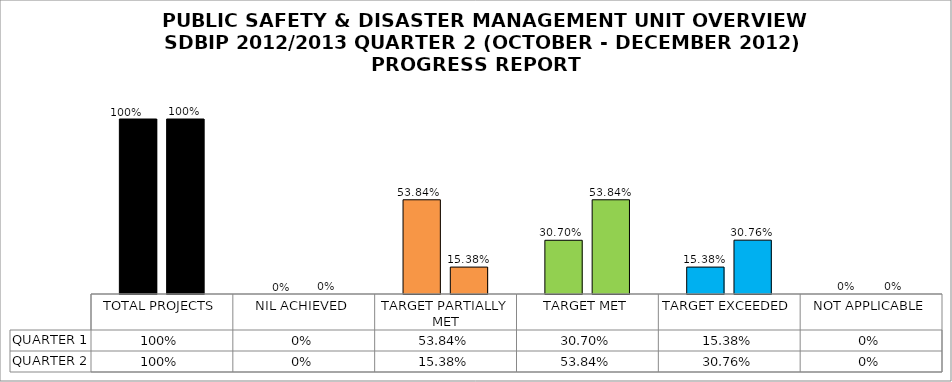
| Category | QUARTER 1 | QUARTER 2 |
|---|---|---|
| TOTAL PROJECTS | 1 | 1 |
| NIL ACHIEVED | 0 | 0 |
| TARGET PARTIALLY MET | 0.538 | 0.154 |
| TARGET MET | 0.307 | 0.538 |
| TARGET EXCEEDED | 0.154 | 0.308 |
| NOT APPLICABLE | 0 | 0 |